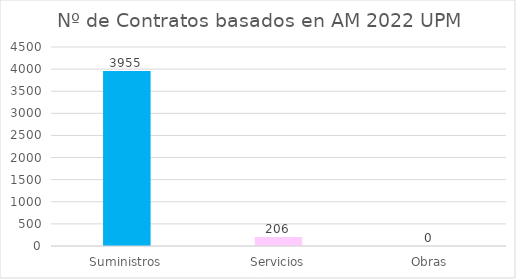
| Category | Series 0 |
|---|---|
| Suministros | 3955 |
| Servicios | 206 |
| Obras | 0 |